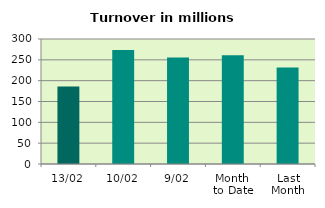
| Category | Series 0 |
|---|---|
| 13/02 | 186.061 |
| 10/02 | 273.366 |
| 9/02 | 255.325 |
| Month 
to Date | 261.023 |
| Last
Month | 231.348 |